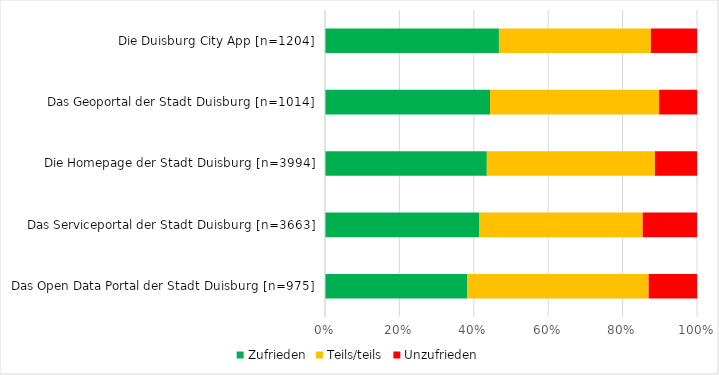
| Category | Zufrieden | Teils/teils | Unzufrieden |
|---|---|---|---|
| Das Open Data Portal der Stadt Duisburg [n=975] | 38.2 | 48.8 | 13 |
| Das Serviceportal der Stadt Duisburg [n=3663] | 41.4 | 44 | 14.6 |
| Die Homepage der Stadt Duisburg [n=3994] | 43.5 | 45.2 | 11.3 |
| Das Geoportal der Stadt Duisburg [n=1014] | 44.4 | 45.5 | 10.2 |
| Die Duisburg City App [n=1204] | 46.8 | 40.9 | 12.4 |